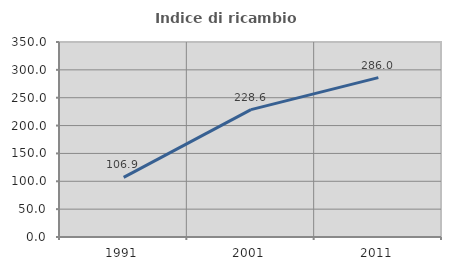
| Category | Indice di ricambio occupazionale  |
|---|---|
| 1991.0 | 106.931 |
| 2001.0 | 228.643 |
| 2011.0 | 286.047 |